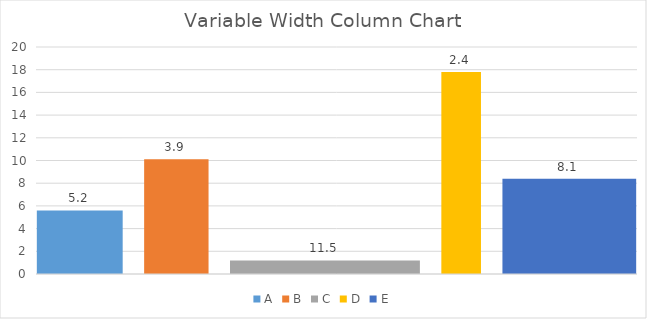
| Category | A | B | C | D | E |
|---|---|---|---|---|---|
| 0.0 | 0 | 0 | 0 | 0 | 0 |
| 0.0 | 5.6 | 0 | 0 | 0 | 0 |
| 52.0 | 5.6 | 0 | 0 | 0 | 0 |
| 52.0 | 0 | 0 | 0 | 0 | 0 |
| 65.0 | 0 | 0 | 0 | 0 | 0 |
| 65.0 | 0 | 10.1 | 0 | 0 | 0 |
| 104.0 | 0 | 10.1 | 0 | 0 | 0 |
| 104.0 | 0 | 0 | 0 | 0 | 0 |
| 117.0 | 0 | 0 | 0 | 0 | 0 |
| 117.0 | 0 | 0 | 1.2 | 0 | 0 |
| 232.0 | 0 | 0 | 1.2 | 0 | 0 |
| 232.0 | 0 | 0 | 0 | 0 | 0 |
| 245.0 | 0 | 0 | 0 | 0 | 0 |
| 245.0 | 0 | 0 | 0 | 17.8 | 0 |
| 269.0 | 0 | 0 | 0 | 17.8 | 0 |
| 269.0 | 0 | 0 | 0 | 0 | 0 |
| 282.0 | 0 | 0 | 0 | 0 | 0 |
| 282.0 | 0 | 0 | 0 | 0 | 8.4 |
| 363.0 | 0 | 0 | 0 | 0 | 8.4 |
| 363.0 | 0 | 0 | 0 | 0 | 0 |